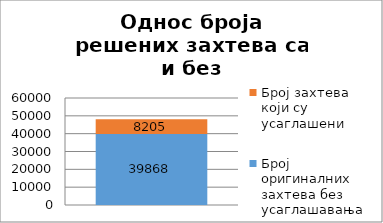
| Category | Број оригиналних захтева без усаглашавања | Број захтева који су усаглашени |
|---|---|---|
| 0 | 39868 | 8205 |